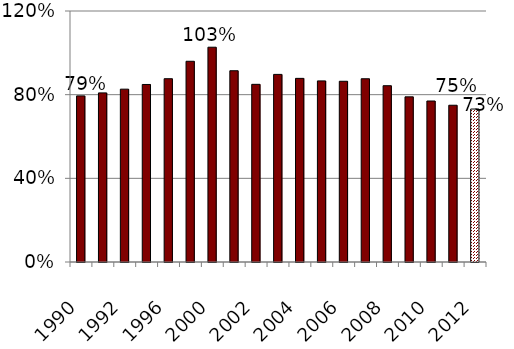
| Category | Series 0 |
|---|---|
| 1990.0 | 0.794 |
| 1991.0 | 0.808 |
| 1992.0 | 0.826 |
| 1994.0 | 0.849 |
| 1996.0 | 0.876 |
| 1998.0 | 0.96 |
| 2000.0 | 1.027 |
| 2001.0 | 0.914 |
| 2002.0 | 0.849 |
| 2003.0 | 0.897 |
| 2004.0 | 0.878 |
| 2005.0 | 0.866 |
| 2006.0 | 0.864 |
| 2007.0 | 0.876 |
| 2008.0 | 0.843 |
| 2009.0 | 0.79 |
| 2010.0 | 0.77 |
| 2011.0 | 0.749 |
| 2012.0 | 0.731 |